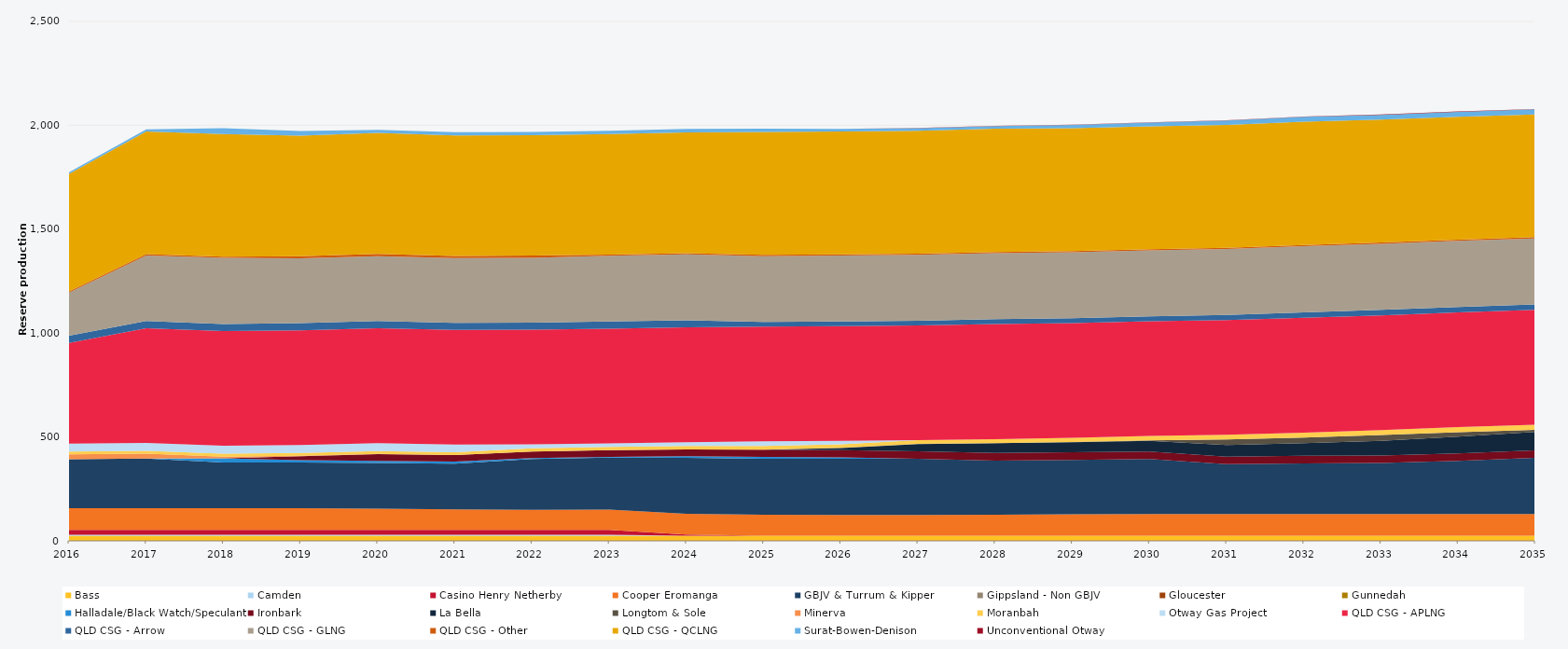
| Category | Bass | Camden | Casino Henry Netherby | Cooper Eromanga | GBJV & Turrum & Kipper | Gippsland - Non GBJV | Gloucester | Gunnedah | Halladale/Black Watch/Speculant | Ironbark | La Bella | Longtom & Sole | Minerva | Moranbah | Otway Gas Project | QLD CSG - APLNG | QLD CSG - Arrow | QLD CSG - GLNG | QLD CSG - Other | QLD CSG - QCLNG | Surat-Bowen-Denison | Unconventional Otway |
|---|---|---|---|---|---|---|---|---|---|---|---|---|---|---|---|---|---|---|---|---|---|---|
| 2016 | 24.522 | 5 | 23.12 | 105 | 235.041 | 0 | 0 | 0 | 0 | 0 | 0 | 0 | 23.79 | 13.077 | 38 | 485.346 | 34.038 | 207.654 | 5.856 | 565.857 | 7.85 | 0 |
| 2017 | 24.455 | 5 | 23.12 | 105 | 238.456 | 0 | 0 | 0 | 0 | 0 | 0 | 0 | 23.725 | 13.709 | 38 | 552.245 | 33.945 | 316.298 | 5.84 | 590.153 | 10.764 | 0 |
| 2018 | 24.455 | 5 | 23.12 | 105 | 220 | 0 | 0 | 0 | 19.157 | 0 | 0 | 0 | 8.546 | 14.12 | 38 | 552.245 | 33.945 | 318.905 | 5.84 | 589.223 | 28.204 | 0 |
| 2019 | 24.455 | 5 | 23.12 | 105 | 220 | 0 | 0 | 0 | 10.95 | 18.25 | 0 | 0 | 3.197 | 13.353 | 38 | 552.245 | 33.945 | 311.917 | 10.403 | 580.594 | 22.318 | 0 |
| 2020 | 24.522 | 5 | 23.12 | 101.757 | 220 | 0 | 0 | 0 | 10.95 | 31.776 | 0 | 0 | 1.492 | 13.322 | 38 | 553.758 | 34.038 | 312.746 | 10.419 | 582.408 | 14.779 | 0 |
| 2021 | 24.455 | 5 | 23.12 | 98.579 | 220 | 0 | 0 | 0 | 9.948 | 31.317 | 0 | 0 | 0 | 13.827 | 36.643 | 552.245 | 33.945 | 311.831 | 10.403 | 579.753 | 15.887 | 0 |
| 2022 | 24.455 | 5 | 23.12 | 97.216 | 244.607 | 0 | 0 | 0 | 3.556 | 32.138 | 0 | 0 | 0 | 15.298 | 19.09 | 552.245 | 33.945 | 311.898 | 10.403 | 579.606 | 15.502 | 0 |
| 2023 | 24.455 | 5 | 23.12 | 98.292 | 249.161 | 0 | 0 | 0 | 4.291 | 32.092 | 0 | 0 | 0 | 16.264 | 16.579 | 552.245 | 33.945 | 316.625 | 5.84 | 579.587 | 16.036 | 0 |
| 2024 | 24.522 | 0 | 5.3 | 100.02 | 270 | 0 | 0 | 0 | 7.855 | 31.833 | 0 | 0 | 0 | 16.79 | 17.779 | 553.758 | 34.038 | 317.359 | 5.856 | 580.592 | 16.464 | 0 |
| 2025 | 24.455 | 0 | 0 | 101.039 | 270 | 0 | 0 | 0 | 8.865 | 34.683 | 0 | 0 | 0 | 17.268 | 23.158 | 552.245 | 22.035 | 316.795 | 5.84 | 591.794 | 15.115 | 0 |
| 2026 | 24.455 | 0 | 0 | 100.577 | 270 | 0 | 0 | 0 | 6.428 | 35.404 | 10.23 | 0.185 | 0 | 17.518 | 16.358 | 552.245 | 22.841 | 316.693 | 5.84 | 591.753 | 12.395 | 0 |
| 2027 | 24.455 | 0 | 0 | 100.606 | 270 | 0 | 0 | 0 | 0 | 36.016 | 34.939 | 0.225 | 0 | 18.14 | 0 | 552.245 | 23.131 | 316.854 | 5.84 | 591.693 | 12.418 | 0.649 |
| 2028 | 24.522 | 0 | 0 | 100.844 | 260.611 | 0 | 0 | 0 | 0 | 36.6 | 47.563 | 0.21 | 0 | 18.99 | 0 | 553.758 | 23.47 | 317.828 | 5.856 | 593.234 | 13.255 | 0.436 |
| 2029 | 24.455 | 0 | 0 | 103.011 | 262.304 | 0 | 0 | 0 | 0 | 36.5 | 48 | 1.542 | 0 | 20.344 | 0 | 552.245 | 23.353 | 316.897 | 5.84 | 591.622 | 15.776 | 0.729 |
| 2030 | 24.455 | 0 | 0 | 105 | 264.048 | 0 | 0 | 0 | 0 | 36.5 | 51.626 | 1.592 | 0 | 21.608 | 0 | 552.245 | 23.602 | 317.279 | 5.84 | 591.579 | 17.949 | 0.653 |
| 2031 | 24.455 | 0 | 0 | 105 | 239.416 | 0 | 0 | 0 | 0 | 36.5 | 55.418 | 27.375 | 0 | 22.555 | 0 | 552.245 | 24.176 | 317.559 | 5.84 | 591.53 | 20.6 | 1.116 |
| 2032 | 24.522 | 0 | 0 | 105 | 242.918 | 0 | 0 | 0 | 0 | 36.6 | 60.656 | 27.45 | 0 | 23.473 | 0 | 553.758 | 25.27 | 318.687 | 5.856 | 593.07 | 23.715 | 1.639 |
| 2033 | 24.455 | 0 | 0 | 105 | 245.205 | 0 | 0 | 0 | 0 | 36.5 | 70.748 | 27.375 | 0 | 23.984 | 0 | 552.245 | 26.292 | 318.155 | 5.84 | 591.435 | 22.674 | 2.618 |
| 2034 | 24.455 | 0 | 0 | 105 | 255.21 | 0 | 0 | 0 | 0 | 36.5 | 80.406 | 20.902 | 0 | 24.559 | 0 | 552.245 | 26.478 | 318.338 | 5.84 | 591.394 | 23.82 | 1.368 |
| 2035 | 24.455 | 0 | 0 | 105 | 269.734 | 0 | 0 | 0 | 0 | 36.5 | 88.768 | 10.215 | 0 | 24.812 | 0 | 552.245 | 26.393 | 317.822 | 5.84 | 591.053 | 23.995 | 1.791 |